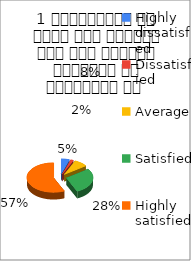
| Category | 1 व्याख्यान से रूचि में वृद्धि हुई एवं शिक्षण जानकारी से परिपूर्ण था  |
|---|---|
| Highly dissatisfied | 3 |
| Dissatisfied | 1 |
| Average | 5 |
| Satisfied | 17 |
| Highly satisfied | 34 |